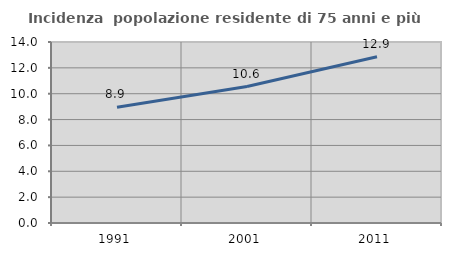
| Category | Incidenza  popolazione residente di 75 anni e più |
|---|---|
| 1991.0 | 8.947 |
| 2001.0 | 10.555 |
| 2011.0 | 12.853 |